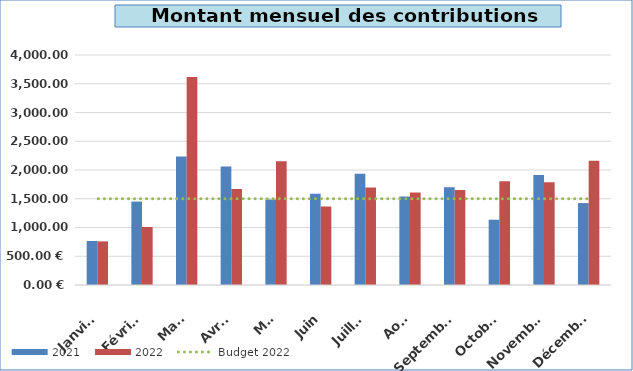
| Category | 2021 | 2022 |
|---|---|---|
| Janvier | 765 | 758.92 |
| Février | 1451.19 | 1009.32 |
| Mars | 2233.52 | 3619.14 |
| Avril | 2062.52 | 1670.54 |
| Mai | 1485.28 | 2150.64 |
| Juin | 1588.29 | 1365.23 |
| Juillet | 1935.91 | 1696.09 |
| Août | 1538.91 | 1609.65 |
| Septembre | 1699.29 | 1651.57 |
| Octobre | 1135.38 | 1803.41 |
| Novembre | 1913.16 | 1786.9 |
| Décembre | 1424.75 | 2159.25 |